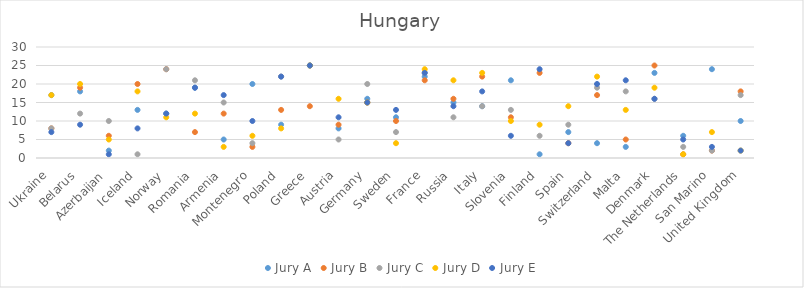
| Category | Jury A | Jury B | Jury C | Jury D | Jury E |
|---|---|---|---|---|---|
| Ukraine | 17 | 8 | 8 | 17 | 7 |
| Belarus | 18 | 19 | 12 | 20 | 9 |
| Azerbaijan | 2 | 6 | 10 | 5 | 1 |
| Iceland | 13 | 20 | 1 | 18 | 8 |
| Norway | 12 | 24 | 24 | 11 | 12 |
| Romania | 19 | 7 | 21 | 12 | 19 |
| Armenia | 5 | 12 | 15 | 3 | 17 |
| Montenegro | 20 | 3 | 4 | 6 | 10 |
| Poland | 9 | 13 | 22 | 8 | 22 |
| Greece | 25 | 14 | 25 | 25 | 25 |
| Austria | 8 | 9 | 5 | 16 | 11 |
| Germany | 16 | 15 | 20 | 15 | 15 |
| Sweden | 11 | 10 | 7 | 4 | 13 |
| France | 22 | 21 | 23 | 24 | 23 |
| Russia | 15 | 16 | 11 | 21 | 14 |
| Italy | 14 | 22 | 14 | 23 | 18 |
| Slovenia | 21 | 11 | 13 | 10 | 6 |
| Finland | 1 | 23 | 6 | 9 | 24 |
| Spain | 7 | 4 | 9 | 14 | 4 |
| Switzerland | 4 | 17 | 19 | 22 | 20 |
| Malta | 3 | 5 | 18 | 13 | 21 |
| Denmark | 23 | 25 | 16 | 19 | 16 |
| The Netherlands | 6 | 1 | 3 | 1 | 5 |
| San Marino | 24 | 2 | 2 | 7 | 3 |
| United Kingdom | 10 | 18 | 17 | 2 | 2 |